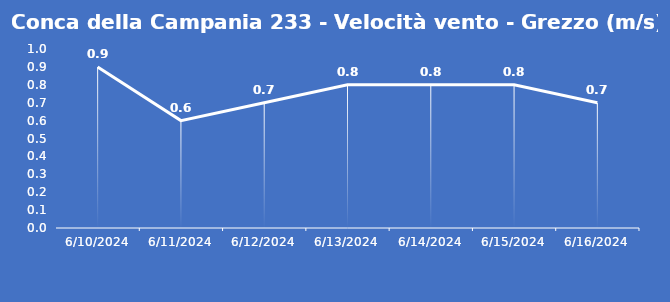
| Category | Conca della Campania 233 - Velocità vento - Grezzo (m/s) |
|---|---|
| 6/10/24 | 0.9 |
| 6/11/24 | 0.6 |
| 6/12/24 | 0.7 |
| 6/13/24 | 0.8 |
| 6/14/24 | 0.8 |
| 6/15/24 | 0.8 |
| 6/16/24 | 0.7 |